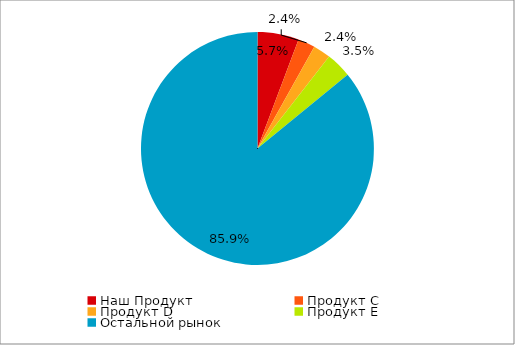
| Category | Series 0 |
|---|---|
| Наш Продукт | 0.057 |
| Продукт С | 0.024 |
| Продукт D | 0.024 |
| Продукт Е | 0.035 |
| Остальной рынок | 0.859 |